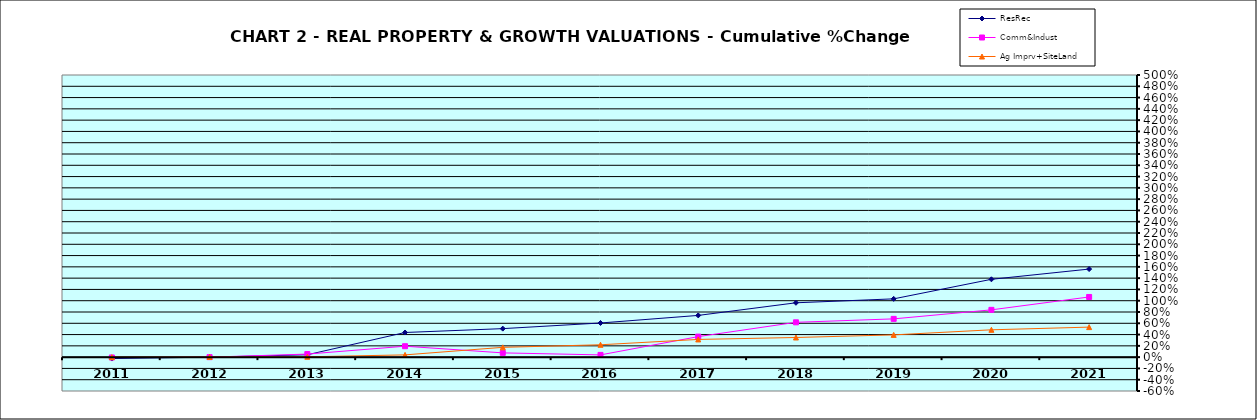
| Category | ResRec | Comm&Indust | Ag Imprv+SiteLand |
|---|---|---|---|
| 2011.0 | -0.025 | -0.006 | 0 |
| 2012.0 | 0 | 0 | 0.003 |
| 2013.0 | 0.042 | 0.054 | 0.006 |
| 2014.0 | 0.437 | 0.194 | 0.04 |
| 2015.0 | 0.505 | 0.075 | 0.174 |
| 2016.0 | 0.605 | 0.04 | 0.219 |
| 2017.0 | 0.74 | 0.364 | 0.314 |
| 2018.0 | 0.963 | 0.617 | 0.348 |
| 2019.0 | 1.033 | 0.678 | 0.395 |
| 2020.0 | 1.379 | 0.838 | 0.484 |
| 2021.0 | 1.561 | 1.066 | 0.532 |